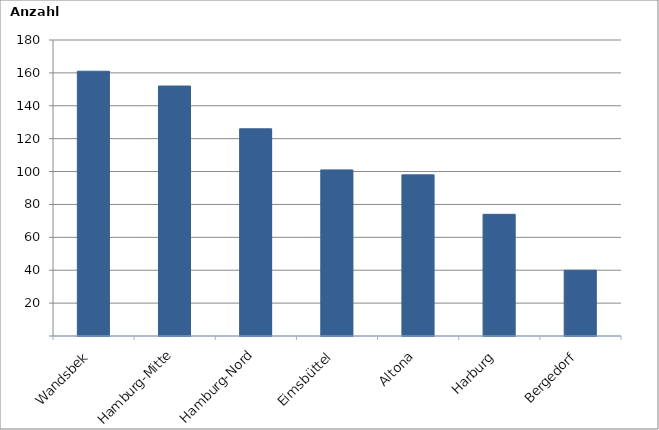
| Category | Series 0 |
|---|---|
| Wandsbek | 161 |
| Hamburg-Mitte | 152 |
| Hamburg-Nord | 126 |
| Eimsbüttel | 101 |
| Altona | 98 |
| Harburg | 74 |
| Bergedorf | 40 |